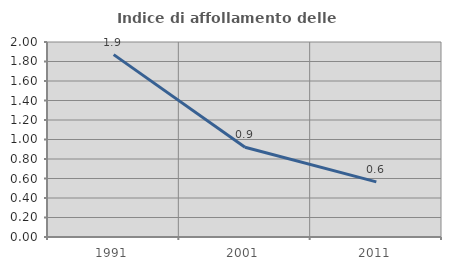
| Category | Indice di affollamento delle abitazioni  |
|---|---|
| 1991.0 | 1.87 |
| 2001.0 | 0.921 |
| 2011.0 | 0.565 |